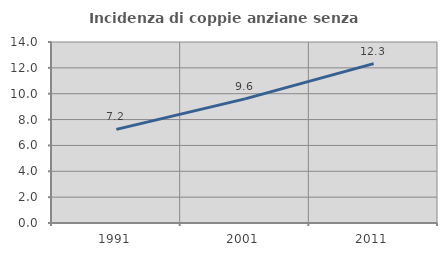
| Category | Incidenza di coppie anziane senza figli  |
|---|---|
| 1991.0 | 7.239 |
| 2001.0 | 9.601 |
| 2011.0 | 12.331 |